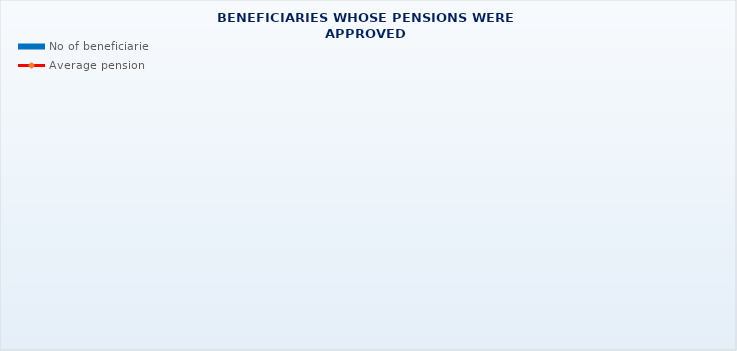
| Category | No of beneficiaries |
|---|---|
| Authorised officials in internal affairs, judicial officers and workers engaged in demining work: | 17264 |
| Pension beneficiaries entitled under the Fire Services Act (Official Gazette 125/19) | 213 |
| Active military personnel - DVO  | 15869 |
| Croatian Homeland Army veterans mobilised from 1941 to 1945 | 2618 |
| Former political prisoners | 2369 |
| Croatian Veterans from the Homeland War - ZOHBDR (Act on Croatian Homeland War Veterans and Their Family Members) | 70820 |
| Pensions approved under general regulations and determined according to the Act on the Rights of Croatian Homeland War Veterans and their Family Members (ZOHBDR), in 2017 (Art. 27, 35, 48 and 49, paragraph 2)    | 52038 |
| Former Yugoslav People's Army members - JNA   | 4336 |
| Former Yugoslav People's Army members - JNA - Art. 185 of Pension Insurance Act (ZOMO)  | 157 |
| National Liberation War veterans - NOR | 6580 |
| Members of the Croatian Parliament, members of the Government, judges of the Constitutional Court and the Auditor General | 686 |
| Members of the Parliamentary Executive Council and administratively retired federal civil servants  (relates to the former SFRY) | 77 |
| Former officials of federal bodies o the former SFRJ -  Article 38 of the Pension Insurance Act (ZOMO) | 24 |
| Full members of the Croatian Academy of Sciences and Arts - HAZU | 131 |
| Miners from the Istrian coal mines "Tupljak" d.d. Labin  | 248 |
| Workers professionally exposed to asbestos | 851 |
| Insurees - crew members on a ship in international and national navigation  - Article  129, paragraph 2 of the Maritime Code | 198 |
| Members of the Croatian Defence Council - HVO  | 6790 |